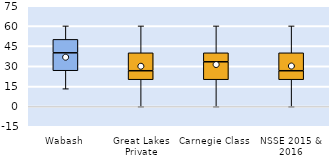
| Category | 25th | 50th | 75th |
|---|---|---|---|
| Wabash | 26.667 | 13.333 | 10 |
| Great Lakes Private | 20 | 6.667 | 13.333 |
| Carnegie Class | 20 | 13.333 | 6.667 |
| NSSE 2015 & 2016 | 20 | 6.667 | 13.333 |